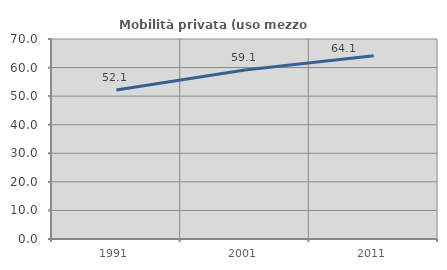
| Category | Mobilità privata (uso mezzo privato) |
|---|---|
| 1991.0 | 52.134 |
| 2001.0 | 59.135 |
| 2011.0 | 64.109 |